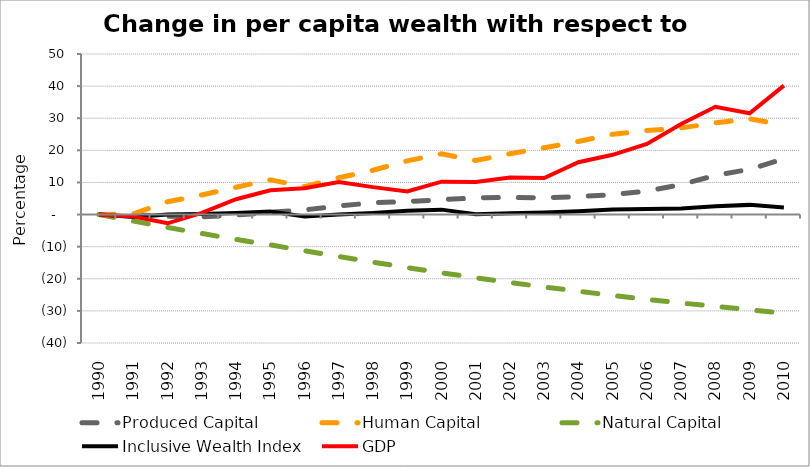
| Category | Produced Capital  | Human Capital | Natural Capital | Inclusive Wealth Index | GDP |
|---|---|---|---|---|---|
| 1990.0 | 0 | 0 | 0 | 0 | 0 |
| 1991.0 | -0.082 | 0.247 | -2.044 | -0.743 | -0.628 |
| 1992.0 | -0.541 | 3.988 | -4.02 | 0.008 | -2.725 |
| 1993.0 | -0.696 | 6.104 | -5.893 | 0.139 | 0.503 |
| 1994.0 | -0.163 | 8.49 | -7.741 | 0.505 | 4.775 |
| 1995.0 | 0.678 | 10.843 | -9.445 | 0.962 | 7.548 |
| 1996.0 | 1.466 | 8.697 | -11.269 | -0.6 | 8.193 |
| 1997.0 | 2.661 | 11.458 | -13.059 | 0.054 | 10.151 |
| 1998.0 | 3.68 | 13.797 | -14.808 | 0.513 | 8.538 |
| 1999.0 | 4.044 | 16.717 | -16.505 | 1.148 | 7.214 |
| 2000.0 | 4.642 | 18.921 | -18.142 | 1.53 | 10.235 |
| 2001.0 | 5.19 | 16.82 | -19.673 | 0.07 | 10.135 |
| 2002.0 | 5.351 | 18.964 | -21.147 | 0.425 | 11.541 |
| 2003.0 | 5.225 | 20.777 | -22.555 | 0.62 | 11.364 |
| 2004.0 | 5.599 | 22.753 | -23.888 | 0.993 | 16.292 |
| 2005.0 | 6.179 | 25.026 | -25.191 | 1.539 | 18.603 |
| 2006.0 | 7.333 | 26.151 | -26.415 | 1.706 | 22.003 |
| 2007.0 | 9.335 | 26.979 | -27.552 | 1.909 | 28.18 |
| 2008.0 | 12.214 | 28.565 | -28.603 | 2.613 | 33.569 |
| 2009.0 | 14.075 | 29.829 | -29.666 | 3.014 | 31.538 |
| 2010.0 | 17.373 | 27.837 | -30.722 | 2.22 | 40.157 |